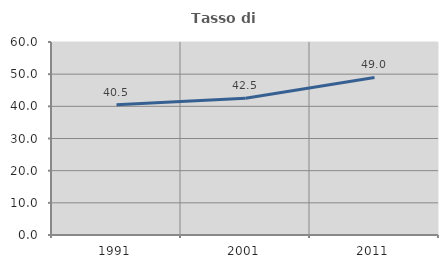
| Category | Tasso di occupazione   |
|---|---|
| 1991.0 | 40.463 |
| 2001.0 | 42.505 |
| 2011.0 | 48.98 |